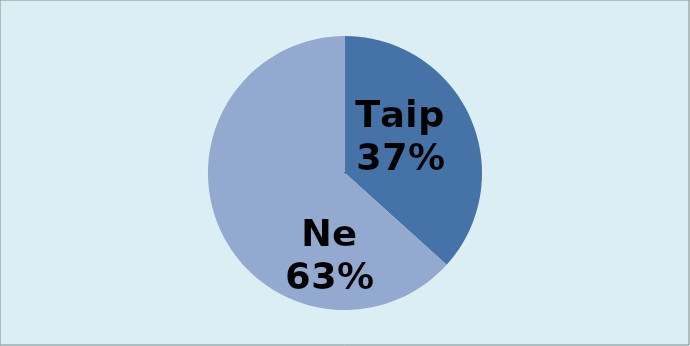
| Category | Series 0 |
|---|---|
| Taip | 40 |
| Ne | 69 |